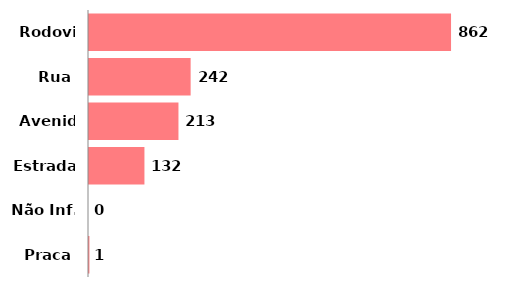
| Category | Qtde |
|---|---|
| Rodovia | 862 |
| Rua | 242 |
| Avenida | 213 |
| Estrada | 132 |
| Não Inf. | 0 |
| Praca | 1 |